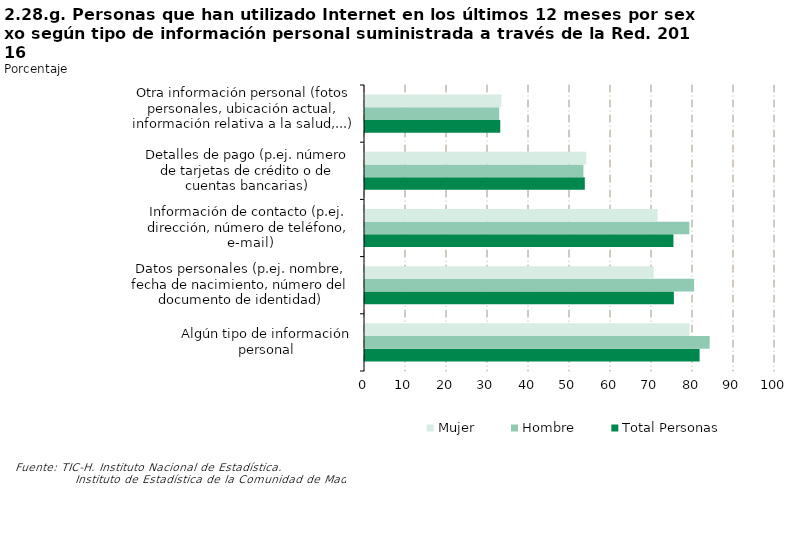
| Category | Total Personas | Hombre | Mujer |
|---|---|---|---|
| Algún tipo de información personal | 81.606 | 84.069 | 79.147 |
| Datos personales (p.ej. nombre, fecha de nacimiento, número del documento de identidad) | 75.338 | 80.273 | 70.411 |
| Información de contacto (p.ej. dirección, número de teléfono, e-mail) | 75.228 | 79.106 | 71.356 |
| Detalles de pago (p.ej. número de tarjetas de crédito o de cuentas bancarias) | 53.61 | 53.275 | 53.945 |
| Otra información personal (fotos personales, ubicación actual, información relativa a la salud,...) | 32.992 | 32.735 | 33.248 |